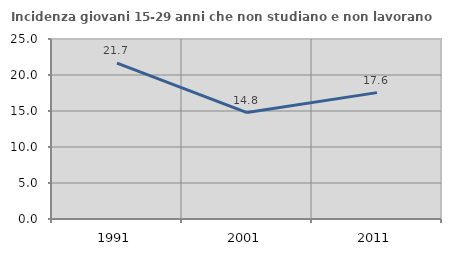
| Category | Incidenza giovani 15-29 anni che non studiano e non lavorano  |
|---|---|
| 1991.0 | 21.652 |
| 2001.0 | 14.782 |
| 2011.0 | 17.554 |